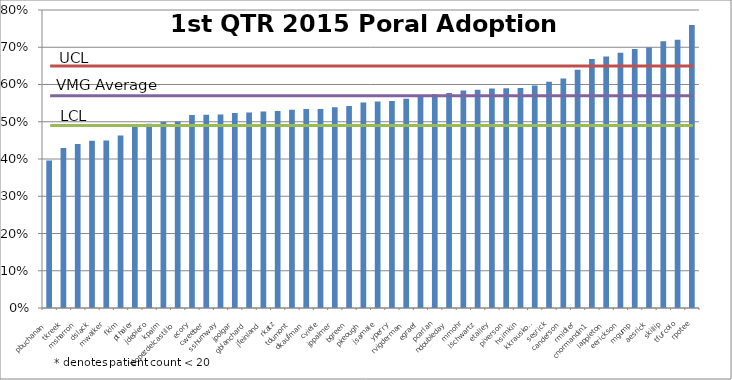
| Category | Series 0 |
|---|---|
| pbuchanan | 0.396 |
| tkreek | 0.429 |
| msharron | 0.44 |
| dslack | 0.449 |
| mwalker | 0.45 |
| fkim | 0.463 |
| pthaler | 0.49 |
| jdepiero | 0.495 |
| kpalm | 0.5 |
| klopezdelcastillo | 0.5 |
| ecory | 0.518 |
| cweeber | 0.519 |
| sshumway | 0.52 |
| jpolgar | 0.524 |
| gblanchard | 0.525 |
| jfeinland | 0.528 |
| rkatz | 0.529 |
| tdumont | 0.532 |
| dkaufman | 0.534 |
| cviele | 0.535 |
| jppalmer | 0.539 |
| bgreen | 0.542 |
| pkeough | 0.551 |
| jsamale | 0.554 |
| yperry | 0.556 |
| rvigderman | 0.562 |
| egraef | 0.569 |
| pcarlan | 0.574 |
| ndoubleday | 0.577 |
| mmohr | 0.584 |
| lschwartz | 0.586 |
| etalley | 0.589 |
| piverson | 0.59 |
| hsimkin | 0.591 |
| kkrauskopf | 0.597 |
| sesrick | 0.607 |
| canderson | 0.616 |
| rmidler | 0.64 |
| cnormandin1 | 0.669 |
| lappleton | 0.675 |
| eerickson | 0.685 |
| mgump | 0.695 |
| aesrick | 0.699 |
| skillip | 0.716 |
| tfurcolo | 0.72 |
| rpotee | 0.76 |